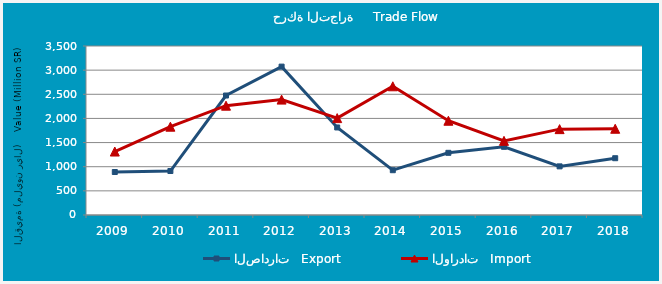
| Category | الصادرات   Export | الواردات   Import |
|---|---|---|
| 2009.0 | 890365844 | 1314200144 |
| 2010.0 | 910924649 | 1828920175 |
| 2011.0 | 2474210457 | 2263900879 |
| 2012.0 | 3073028009 | 2389752422 |
| 2013.0 | 1812872990 | 2006569959 |
| 2014.0 | 927654520 | 2665625467 |
| 2015.0 | 1287826403 | 1951924722 |
| 2016.0 | 1412092860 | 1535659434 |
| 2017.0 | 1007157336 | 1778252169 |
| 2018.0 | 1176259095 | 1785967125 |